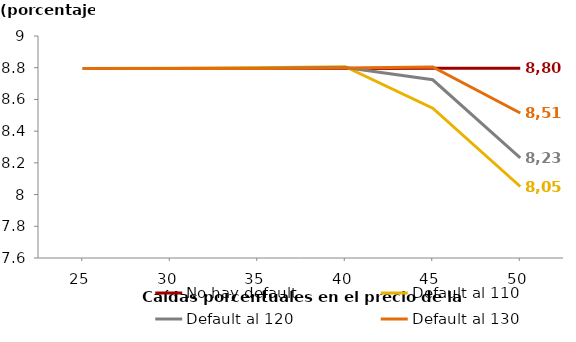
| Category | No hay default | Default al 110 | Default al 120 | Default al 130 |
|---|---|---|---|---|
| 25.0 | 8.795 | 8.795 | 8.795 | 8.795 |
| 30.0 | 8.795 | 8.796 | 8.795 | 8.795 |
| 35.0 | 8.795 | 8.799 | 8.797 | 8.795 |
| 40.0 | 8.795 | 8.806 | 8.802 | 8.798 |
| 45.0 | 8.796 | 8.545 | 8.724 | 8.804 |
| 50.0 | 8.797 | 8.051 | 8.231 | 8.514 |